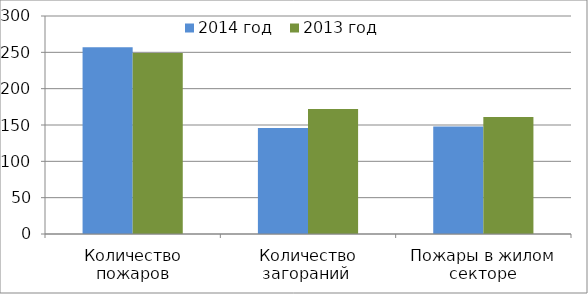
| Category | 2014 год | 2013 год |
|---|---|---|
| Количество пожаров | 257 | 249 |
| Количество загораний  | 146 | 172 |
| Пожары в жилом секторе | 148 | 161 |